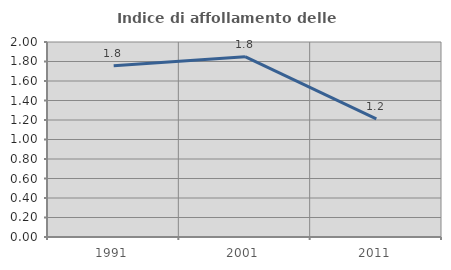
| Category | Indice di affollamento delle abitazioni  |
|---|---|
| 1991.0 | 1.755 |
| 2001.0 | 1.849 |
| 2011.0 | 1.212 |